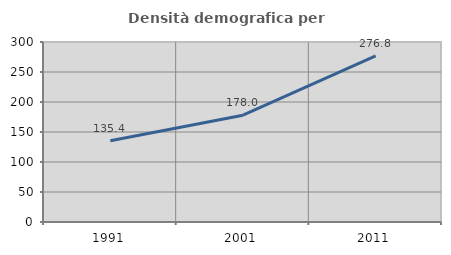
| Category | Densità demografica |
|---|---|
| 1991.0 | 135.385 |
| 2001.0 | 178.036 |
| 2011.0 | 276.803 |